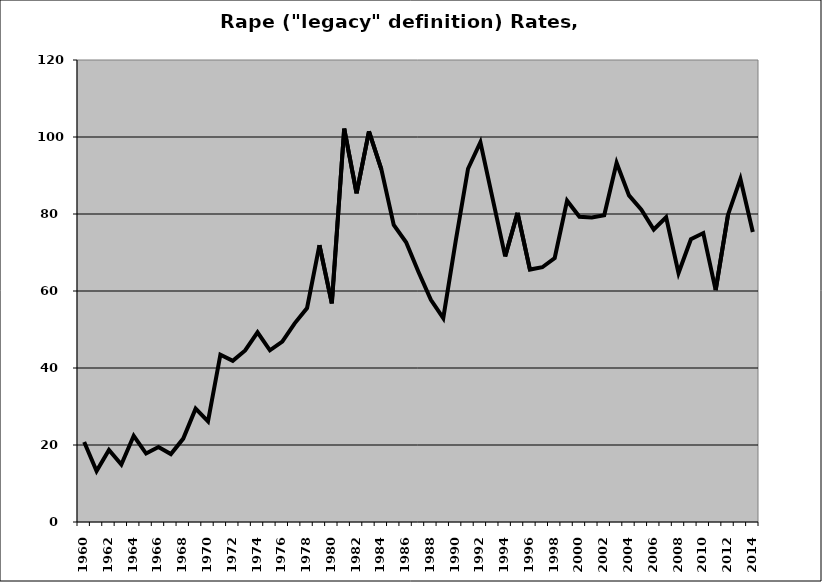
| Category | Rape |
|---|---|
| 1960.0 | 20.781 |
| 1961.0 | 13.248 |
| 1962.0 | 18.699 |
| 1963.0 | 14.919 |
| 1964.0 | 22.4 |
| 1965.0 | 17.787 |
| 1966.0 | 19.485 |
| 1967.0 | 17.647 |
| 1968.0 | 21.661 |
| 1969.0 | 29.433 |
| 1970.0 | 26.144 |
| 1971.0 | 43.45 |
| 1972.0 | 41.846 |
| 1973.0 | 44.545 |
| 1974.0 | 49.258 |
| 1975.0 | 44.602 |
| 1976.0 | 46.859 |
| 1977.0 | 51.597 |
| 1978.0 | 55.583 |
| 1979.0 | 71.921 |
| 1980.0 | 56.8 |
| 1981.0 | 102.184 |
| 1982.0 | 85.388 |
| 1983.0 | 101.461 |
| 1984.0 | 91.6 |
| 1985.0 | 77.159 |
| 1986.0 | 72.659 |
| 1987.0 | 64.952 |
| 1988.0 | 57.7 |
| 1989.0 | 52.941 |
| 1990.0 | 72.903 |
| 1991.0 | 91.754 |
| 1992.0 | 98.637 |
| 1993.0 | 83.806 |
| 1994.0 | 68.977 |
| 1995.0 | 80.298 |
| 1996.0 | 65.568 |
| 1997.0 | 66.174 |
| 1998.0 | 68.567 |
| 1999.0 | 83.454 |
| 2000.0 | 79.275 |
| 2001.0 | 79.068 |
| 2002.0 | 79.659 |
| 2003.0 | 93.324 |
| 2004.0 | 84.834 |
| 2005.0 | 81.115 |
| 2006.0 | 75.964 |
| 2007.0 | 79.154 |
| 2008.0 | 64.668 |
| 2009.0 | 73.446 |
| 2010.0 | 75.046 |
| 2011.0 | 60.233 |
| 2012.0 | 79.829 |
| 2013.0 | 89.114 |
| 2014.0 | 75.333 |